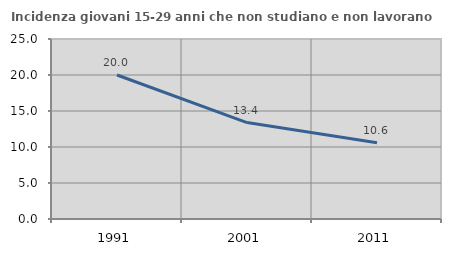
| Category | Incidenza giovani 15-29 anni che non studiano e non lavorano  |
|---|---|
| 1991.0 | 20 |
| 2001.0 | 13.392 |
| 2011.0 | 10.588 |